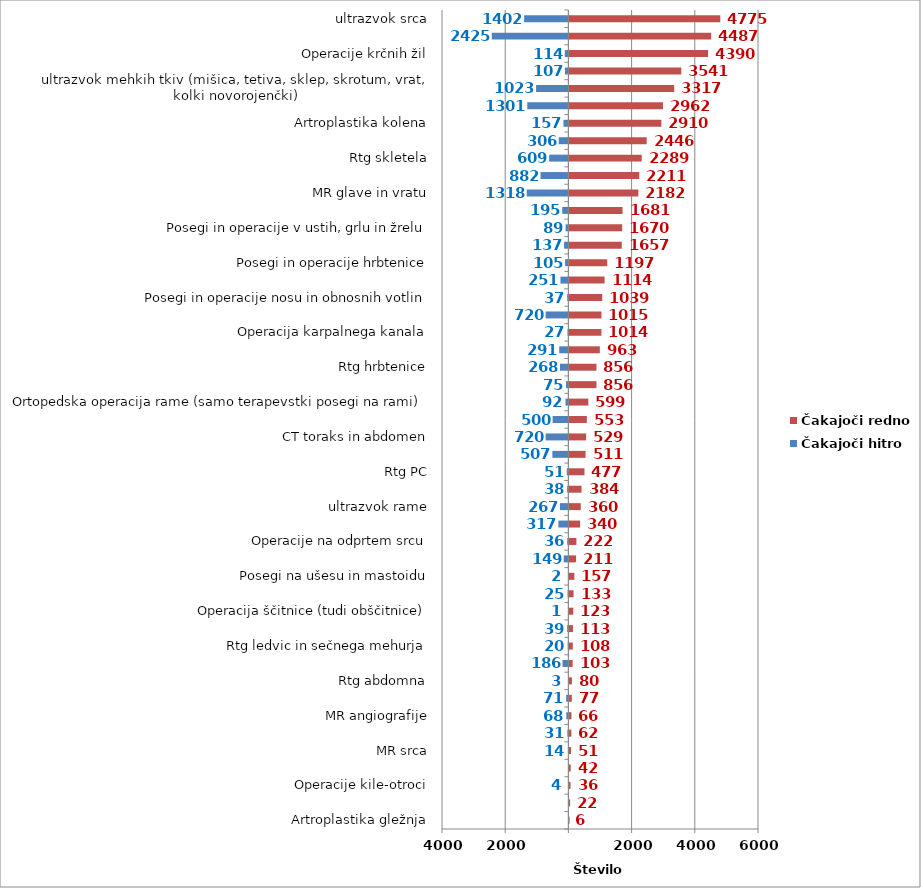
| Category | Čakajoči hitro | Čakajoči redno |
|---|---|---|
| Artroplastika gležnja | 0 | 6 |
| Sklerozacija krčnih žil | 0 | 22 |
| Operacije kile-otroci | -4 | 36 |
| Posegi na arterijah (brez PTA) | 0 | 42 |
| MR srca | -14 | 51 |
| PTA (perkutana transluminalna angioplastika) | -31 | 62 |
| MR angiografije | -68 | 66 |
| Angiografija (brez koronarne angiografije) | -71 | 77 |
| Rtg abdomna | -3 | 80 |
| MR toraks in abdomen | -186 | 103 |
| Rtg ledvic in sečnega mehurja | -20 | 108 |
| CT srca | -39 | 113 |
| Operacija ščitnice (tudi obščitnice) | -1 | 123 |
| Rtg glave | -25 | 133 |
| Posegi na ušesu in mastoidu | -2 | 157 |
| Elektroencefalografija (EEG) | -149 | 211 |
| Operacije na odprtem srcu | -36 | 222 |
| CT angiografije | -317 | 340 |
| ultrazvok rame | -267 | 360 |
| Drugi posegi na perifernem ožilju | -38 | 384 |
| Rtg PC | -51 | 477 |
| Koronarna angiografija in PTCA | -507 | 511 |
| CT toraks in abdomen | -720 | 529 |
| CT skeleta | -500 | 553 |
| Ortopedska operacija rame (samo terapevstki posegi na rami) | -92 | 599 |
| Operacije žolčnih kamnov | -75 | 856 |
| Rtg hrbtenice | -268 | 856 |
| Rtg mamografija | -291 | 963 |
| Operacija karpalnega kanala | -27 | 1014 |
| CT glave in vratu | -720 | 1015 |
| Posegi in operacije nosu in obnosnih votlin | -37 | 1039 |
| ultrazvok dojke | -251 | 1114 |
| Posegi in operacije hrbtenice | -105 | 1197 |
| Operacije kile-odrasli | -137 | 1657 |
| Posegi in operacije v ustih, grlu in žrelu | -89 | 1670 |
| Terapevtske artroskopije (kolenske križne vezi, kolena) | -195 | 1681 |
| MR glave in vratu | -1318 | 2182 |
| ultrazvok vratnih žil | -882 | 2211 |
| Rtg skletela | -609 | 2289 |
| Artroplastika kolka (protetika, endoproteza) | -306 | 2446 |
| Artroplastika kolena | -157 | 2910 |
| Elektromiografija (EMG) | -1301 | 2962 |
| ultrazvok mehkih tkiv (mišica, tetiva, sklep, skrotum, vrat, kolki novorojenčki) | -1023 | 3317 |
| Operacija sive mrene (katarakta) | -107 | 3541 |
| Operacije krčnih žil | -114 | 4390 |
| MR skeleta | -2425 | 4487 |
| ultrazvok srca | -1402 | 4775 |